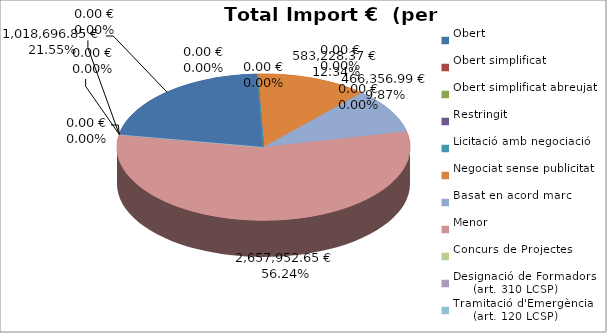
| Category | Total preu
(amb IVA) |
|---|---|
| Obert | 1018696.85 |
| Obert simplificat | 0 |
| Obert simplificat abreujat | 0 |
| Restringit | 0 |
| Licitació amb negociació | 0 |
| Negociat sense publicitat | 583228.373 |
| Basat en acord marc | 466356.99 |
| Menor | 2657952.65 |
| Concurs de Projectes | 0 |
| Designació de Formadors
     (art. 310 LCSP) | 0 |
| Tramitació d'Emergència
     (art. 120 LCSP) | 0 |